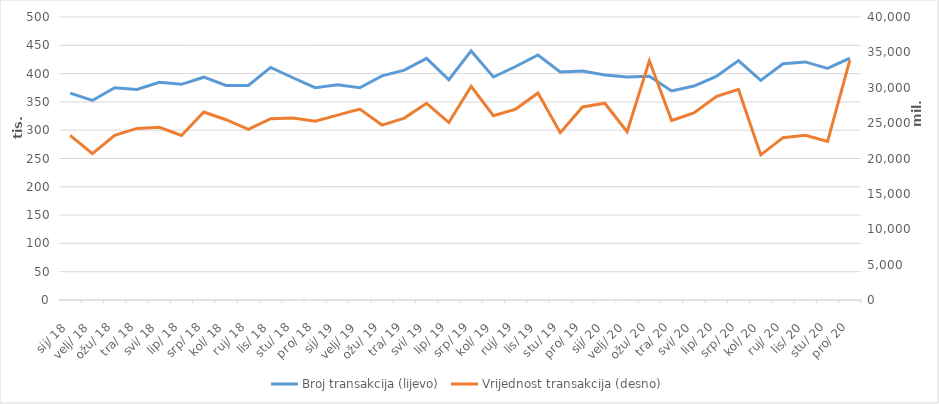
| Category | Broj transakcija (lijevo) |
|---|---|
| 2018-01-01 | 365600 |
| 2018-02-01 | 352582 |
| 2018-03-01 | 375038 |
| 2018-04-01 | 372079 |
| 2018-05-01 | 384734 |
| 2018-06-01 | 381024 |
| 2018-07-01 | 393622 |
| 2018-08-01 | 379020 |
| 2018-09-01 | 379049 |
| 2018-10-01 | 410941 |
| 2018-11-01 | 392655 |
| 2018-12-01 | 375234 |
| 2019-01-01 | 380359 |
| 2019-02-01 | 375009 |
| 2019-03-01 | 395954 |
| 2019-04-01 | 406158 |
| 2019-05-01 | 426793 |
| 2019-06-01 | 389153 |
| 2019-07-01 | 440048 |
| 2019-08-01 | 393966 |
| 2019-09-01 | 412510 |
| 2019-10-01 | 432858 |
| 2019-11-01 | 402998 |
| 2019-12-01 | 404588 |
| 2020-01-01 | 397528 |
| 2020-02-01 | 394017 |
| 2020-03-01 | 395464 |
| 2020-04-01 | 369473 |
| 2020-05-01 | 377996 |
| 2020-06-01 | 394976 |
| 2020-07-01 | 422901 |
| 2020-08-01 | 388054 |
| 2020-09-01 | 417454 |
| 2020-10-01 | 420638 |
| 2020-11-01 | 409271 |
| 2020-12-01 | 427164 |